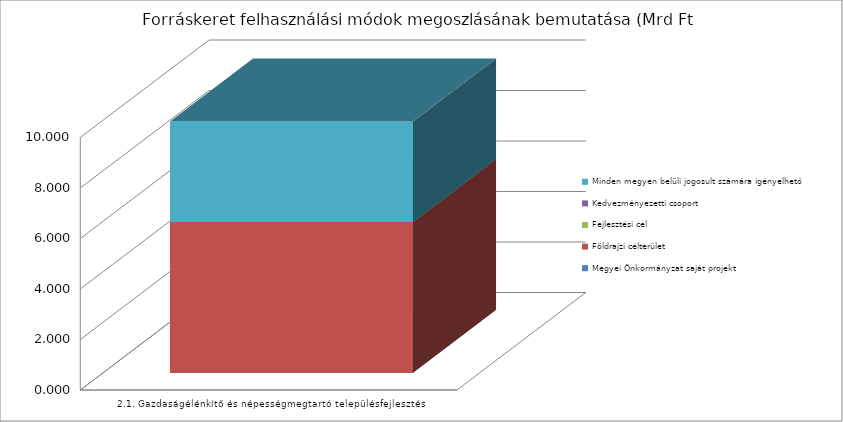
| Category | Megyei Önkormányzat saját projekt | Földrajzi célterület  | Fejlesztési cél  | Kedvezményezetti csoport | Minden megyén belüli jogosult számára igényelhető |
|---|---|---|---|---|---|
|  2.1. Gazdaságélénkítő és népességmegtartó településfejlesztés  | 0 | 5.972 | 0 | 0 | 3.98 |